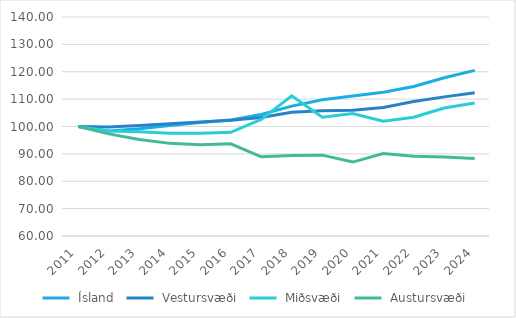
| Category |   Ísland   |   Vestursvæði   |   Miðsvæði   |   Austursvæði   |
|---|---|---|---|---|
| 2011.0 | 100 | 100 | 100 | 100 |
| 2012.0 | 98.345 | 99.813 | 98.386 | 97.3 |
| 2013.0 | 99.17 | 100.384 | 98.063 | 95.274 |
| 2014.0 | 100.398 | 100.982 | 97.552 | 93.84 |
| 2015.0 | 101.436 | 101.621 | 97.526 | 93.333 |
| 2016.0 | 102.382 | 102.239 | 97.875 | 93.671 |
| 2017.0 | 104.414 | 103.294 | 102.582 | 88.945 |
| 2018.0 | 107.452 | 105.179 | 111.189 | 89.451 |
| 2019.0 | 109.74 | 105.715 | 103.362 | 89.536 |
| 2020.0 | 111.176 | 105.907 | 104.761 | 87.004 |
| 2021.0 | 112.512 | 106.93 | 101.91 | 90.127 |
| 2022.0 | 114.591 | 109.112 | 103.389 | 89.114 |
| 2023.0 | 117.826 | 110.827 | 106.778 | 88.861 |
| 2024.0 | 120.497 | 112.359 | 108.58 | 88.27 |